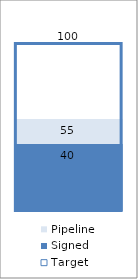
| Category | Pipeline | Signed | Target |
|---|---|---|---|
| 0 | 55 | 40 | 100 |